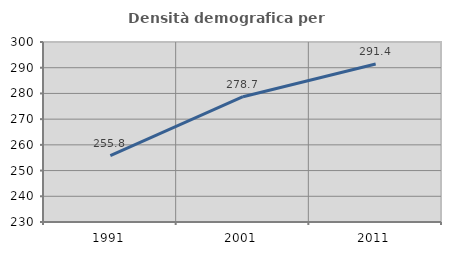
| Category | Densità demografica |
|---|---|
| 1991.0 | 255.848 |
| 2001.0 | 278.737 |
| 2011.0 | 291.442 |